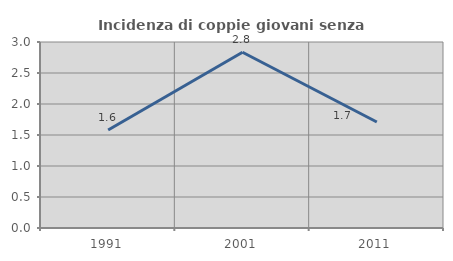
| Category | Incidenza di coppie giovani senza figli |
|---|---|
| 1991.0 | 1.581 |
| 2001.0 | 2.834 |
| 2011.0 | 1.709 |